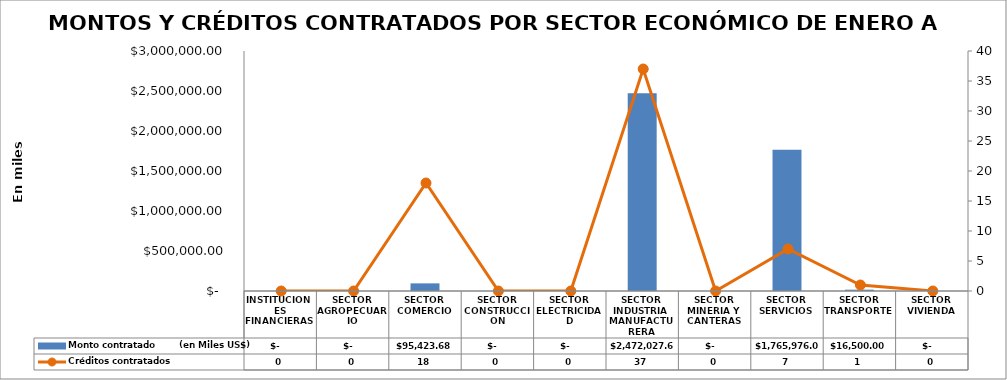
| Category | Monto contratado        (en Miles US$) |
|---|---|
| INSTITUCIONES FINANCIERAS | 0 |
| SECTOR AGROPECUARIO | 0 |
| SECTOR COMERCIO | 95423.68 |
| SECTOR CONSTRUCCION | 0 |
| SECTOR ELECTRICIDAD | 0 |
| SECTOR INDUSTRIA MANUFACTURERA | 2472027.6 |
| SECTOR MINERIA Y CANTERAS | 0 |
| SECTOR SERVICIOS | 1765976.09 |
| SECTOR TRANSPORTE | 16500 |
| SECTOR VIVIENDA | 0 |